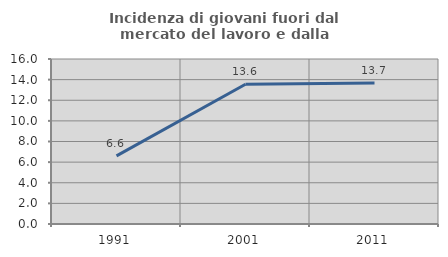
| Category | Incidenza di giovani fuori dal mercato del lavoro e dalla formazione  |
|---|---|
| 1991.0 | 6.61 |
| 2001.0 | 13.553 |
| 2011.0 | 13.684 |